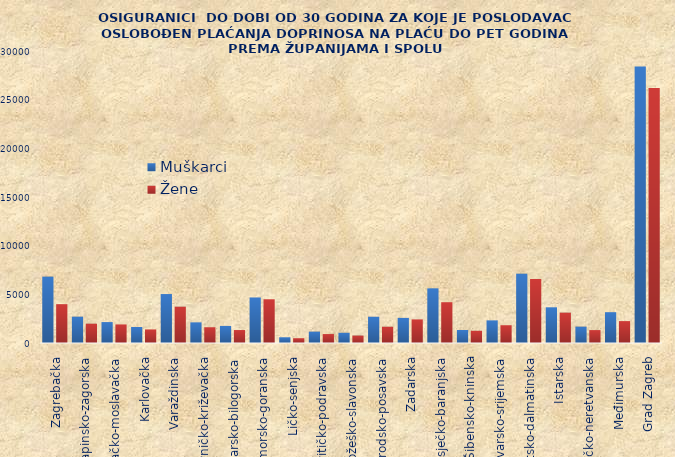
| Category | Muškarci | Žene |
|---|---|---|
| Zagrebačka | 6819 | 3989 |
| Krapinsko-zagorska | 2705 | 1984 |
| Sisačko-moslavačka | 2150 | 1907 |
| Karlovačka | 1644 | 1394 |
| Varaždinska | 5030 | 3731 |
| Koprivničko-križevačka | 2121 | 1618 |
| Bjelovarsko-bilogorska | 1754 | 1332 |
| Primorsko-goranska | 4678 | 4493 |
| Ličko-senjska | 590 | 492 |
| Virovitičko-podravska | 1170 | 918 |
| Požeško-slavonska | 1049 | 765 |
| Brodsko-posavska | 2697 | 1671 |
| Zadarska | 2580 | 2424 |
| Osječko-baranjska | 5618 | 4191 |
| Šibensko-kninska | 1335 | 1257 |
| Vukovarsko-srijemska | 2324 | 1826 |
| Splitsko-dalmatinska | 7122 | 6573 |
| Istarska | 3668 | 3119 |
| Dubrovačko-neretvanska | 1681 | 1327 |
| Međimurska | 3166 | 2249 |
| Grad Zagreb | 28415 | 26193 |